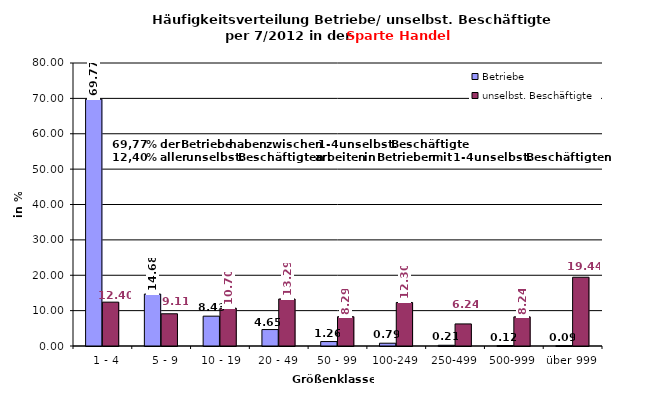
| Category | Betriebe | unselbst. Beschäftigte |
|---|---|---|
|   1 - 4 | 69.772 | 12.398 |
|   5 - 9 | 14.678 | 9.11 |
|  10 - 19 | 8.434 | 10.697 |
| 20 - 49 | 4.647 | 13.291 |
| 50 - 99 | 1.255 | 8.285 |
| 100-249 | 0.788 | 12.303 |
| 250-499 | 0.207 | 6.238 |
| 500-999 | 0.124 | 8.24 |
| über 999 | 0.093 | 19.438 |